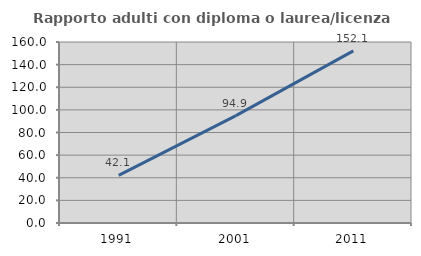
| Category | Rapporto adulti con diploma o laurea/licenza media  |
|---|---|
| 1991.0 | 42.105 |
| 2001.0 | 94.915 |
| 2011.0 | 152.124 |